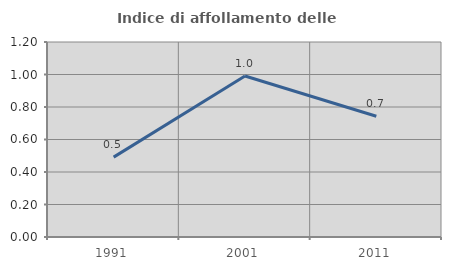
| Category | Indice di affollamento delle abitazioni  |
|---|---|
| 1991.0 | 0.492 |
| 2001.0 | 0.991 |
| 2011.0 | 0.743 |